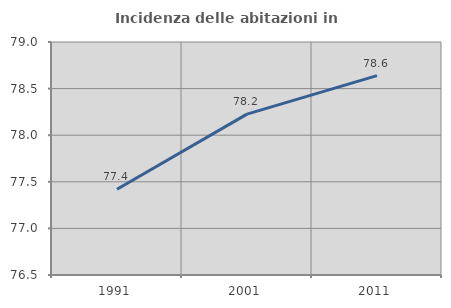
| Category | Incidenza delle abitazioni in proprietà  |
|---|---|
| 1991.0 | 77.419 |
| 2001.0 | 78.226 |
| 2011.0 | 78.639 |